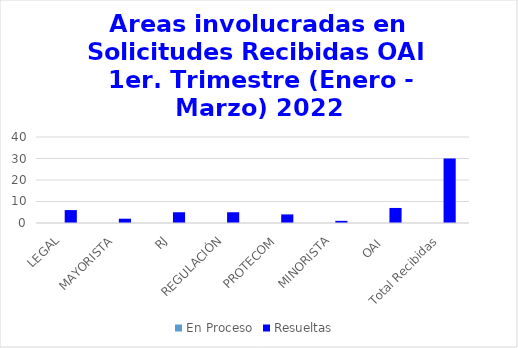
| Category | En Proceso | Resueltas  |
|---|---|---|
| LEGAL | 0 | 6 |
| MAYORISTA | 0 | 2 |
| RJ | 0 | 5 |
| REGULACIÓN | 0 | 5 |
| PROTECOM | 0 | 4 |
| MINORISTA | 0 | 1 |
| OAI  | 0 | 7 |
| Total Recibidas | 0 | 30 |